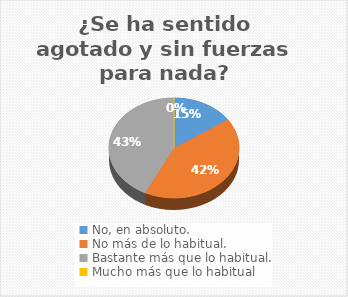
| Category | 3 |
|---|---|
| No, en absoluto. | 17 |
| No más de lo habitual. | 46 |
| Bastante más que lo habitual. | 47 |
| Mucho más que lo habitual | 0 |